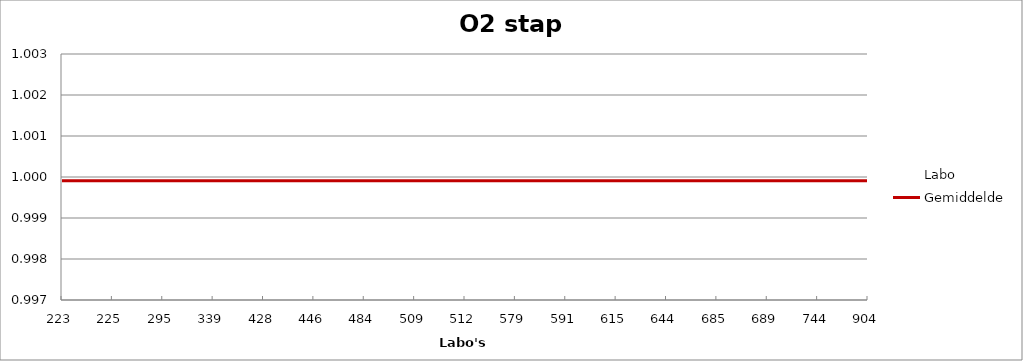
| Category | Labo | Gemiddelde |
|---|---|---|
| 223.0 | 1 | 1 |
| 225.0 | 1 | 1 |
| 295.0 | 1 | 1 |
| 339.0 | 1 | 1 |
| 428.0 | 1 | 1 |
| 446.0 | 1 | 1 |
| 484.0 | 1.001 | 1 |
| 509.0 | 1 | 1 |
| 512.0 | 1 | 1 |
| 579.0 | 1 | 1 |
| 591.0 | 1 | 1 |
| 615.0 | 0.999 | 1 |
| 644.0 | 1 | 1 |
| 685.0 | 0.999 | 1 |
| 689.0 | 1 | 1 |
| 744.0 | 1 | 1 |
| 904.0 | 0.999 | 1 |